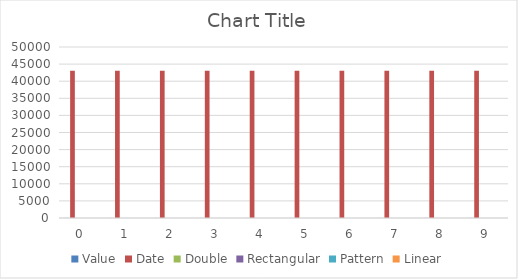
| Category | Value | Date | Double | Rectangular | Pattern | Linear |
|---|---|---|---|---|---|---|
| 0 | 16 | 11/28/17 | 7.223 | 0 | 0 | 0 |
| 1 | 16 | 11/28/17 | 7.223 | 0 | 0 | 0 |
| 2 | 16 | 11/28/17 | 7.223 | 0 | 0 | 0 |
| 3 | 16 | 11/28/17 | 7.223 | 0 | 0 | 0 |
| 4 | 16 | 11/28/17 | 7.223 | 0 | 0 | 0 |
| 5 | 17 | 11/29/17 | 7.224 | 0 | 0 | 0 |
| 6 | 18 | 11/30/17 | 7.225 | 0 | 0 | 0 |
| 7 | 19 | 12/1/17 | 7.226 | 0 | 0 | 0 |
| 8 | 20 | 12/2/17 | 7.227 | 0 | 0 | 0 |
| 9 | 21 | 12/3/17 | 7.228 | 0 | 0 | 0 |